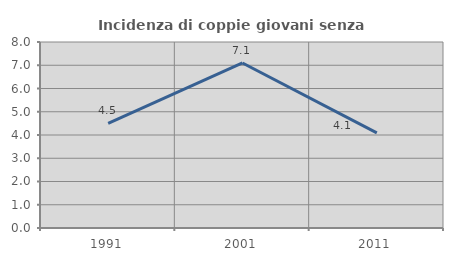
| Category | Incidenza di coppie giovani senza figli |
|---|---|
| 1991.0 | 4.505 |
| 2001.0 | 7.098 |
| 2011.0 | 4.093 |